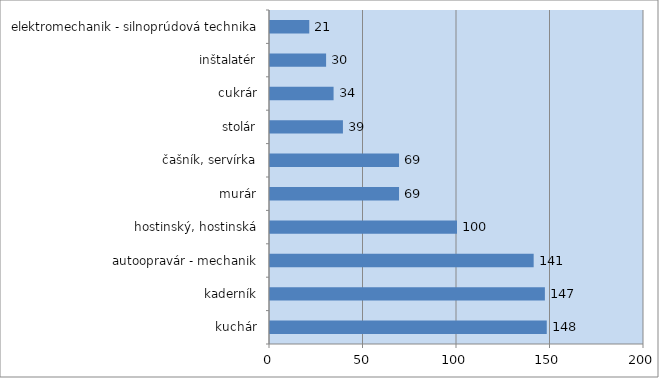
| Category | Series 0 |
|---|---|
| kuchár | 148 |
| kaderník | 147 |
| autoopravár - mechanik | 141 |
| hostinský, hostinská | 100 |
| murár | 69 |
| čašník, servírka | 69 |
| stolár | 39 |
| cukrár | 34 |
| inštalatér | 30 |
| elektromechanik - silnoprúdová technika | 21 |